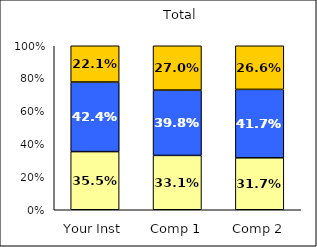
| Category | Low Habits of Mind | Average Habits of Mind | High Habits of Mind |
|---|---|---|---|
| Your Inst | 0.355 | 0.424 | 0.221 |
| Comp 1 | 0.331 | 0.398 | 0.27 |
| Comp 2 | 0.317 | 0.417 | 0.266 |